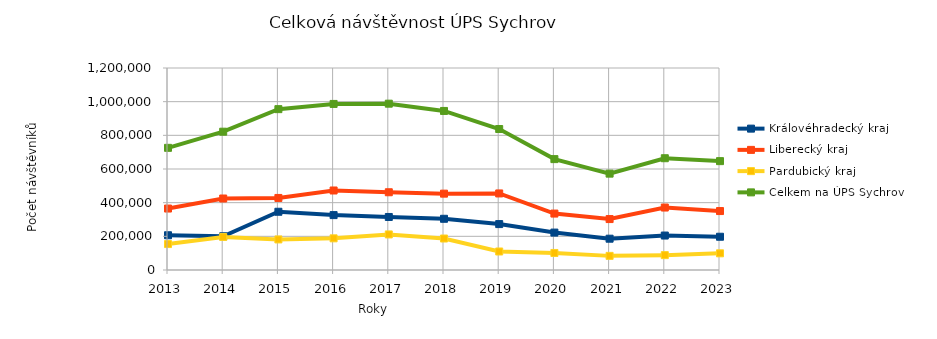
| Category | Královéhradecký kraj | Liberecký kraj | Pardubický kraj | Celkem na ÚPS Sychrov |
|---|---|---|---|---|
| 2013.0 | 206419 | 365108 | 154165 | 725692 |
| 2014.0 | 200438 | 424718 | 196473 | 821629 |
| 2015.0 | 345970 | 428023 | 181567 | 955560 |
| 2016.0 | 326137 | 472318 | 188108 | 986563 |
| 2017.0 | 314983 | 461803 | 211268 | 988054 |
| 2018.0 | 304267 | 453568 | 187017 | 944852 |
| 2019.0 | 272720 | 454785 | 109949 | 837454 |
| 2020.0 | 222238 | 335261 | 101211 | 658710 |
| 2021.0 | 185934 | 302574 | 83925 | 572433 |
| 2022.0 | 204678 | 371041 | 88282 | 664001 |
| 2023.0 | 197536 | 350124 | 99082 | 646742 |